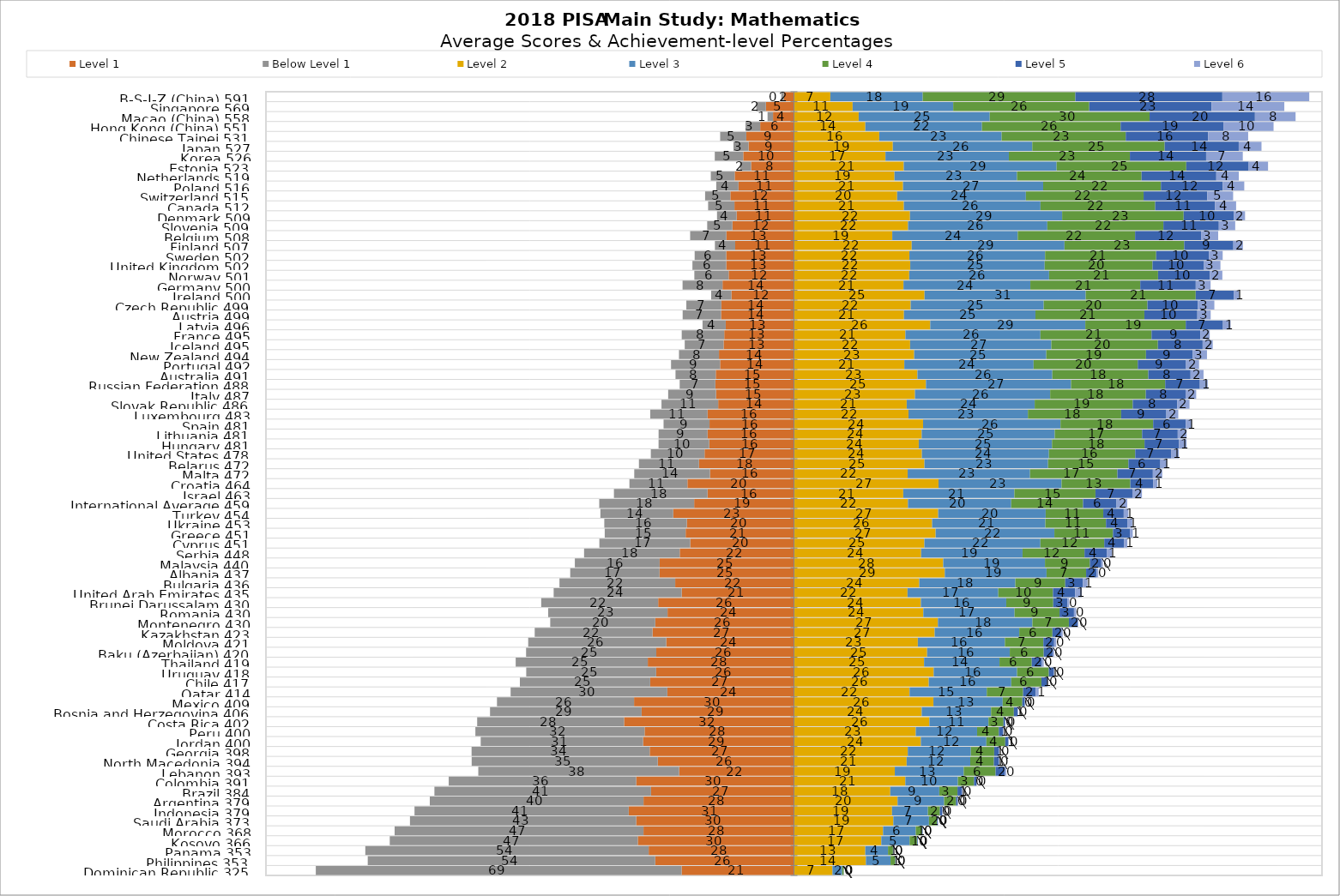
| Category | Level 1                | Below Level 1      | Level 2          | Level 3                | Level 4                | Level 5            | Level 6         |
|---|---|---|---|---|---|---|---|
| Dominican Republic 325 | -21.278 | -69.28 | 7.291 | 1.844 | 0.279 | 0.028 | 0 |
| Philippines 353 | -26.277 | -54.444 | 13.62 | 4.67 | 0.911 | 0.076 | 0.003 |
| Panama 353 | -27.518 | -53.663 | 13.5 | 4.308 | 0.939 | 0.072 | 0.001 |
| Kosovo 366 | -29.581 | -46.97 | 16.535 | 5.367 | 1.399 | 0.135 | 0.012 |
| Morocco 368 | -28.499 | -47.133 | 16.869 | 6.201 | 1.164 | 0.131 | 0.003 |
| Saudi Arabia 373 | -29.887 | -42.836 | 18.816 | 6.752 | 1.532 | 0.159 | 0.017 |
| Indonesia 379 | -31.296 | -40.568 | 18.568 | 6.804 | 2.272 | 0.45 | 0.043 |
| Argentina 379 | -28.494 | -40.473 | 19.619 | 8.82 | 2.257 | 0.328 | 0.01 |
| Brazil 384 | -27.069 | -41.025 | 18.237 | 9.284 | 3.446 | 0.81 | 0.13 |
| Colombia 391 | -29.886 | -35.501 | 21.089 | 9.95 | 3.059 | 0.487 | 0.029 |
| Lebanon 393 | -21.751 | -38.034 | 19.096 | 13.057 | 6.028 | 1.74 | 0.293 |
| North Macedonia 394 | -25.795 | -35.241 | 21.338 | 12.054 | 4.475 | 0.957 | 0.14 |
| Georgia 398 | -27.323 | -33.731 | 21.554 | 11.947 | 4.421 | 0.915 | 0.109 |
| Jordan 400 | -28.578 | -30.748 | 24.03 | 12.411 | 3.571 | 0.599 | 0.064 |
| Peru 400 | -28.295 | -32.041 | 23.063 | 11.622 | 4.119 | 0.79 | 0.071 |
| Costa Rica 402 | -32.18 | -27.818 | 25.645 | 11.194 | 2.842 | 0.313 | 0.008 |
| Bosnia and Herzegovina 406 | -28.855 | -28.709 | 24.193 | 13.137 | 4.314 | 0.738 | 0.054 |
| Mexico 409 | -30.285 | -25.962 | 26.412 | 13.119 | 3.714 | 0.469 | 0.039 |
| Qatar 414 | -23.984 | -29.677 | 21.898 | 14.615 | 6.881 | 2.383 | 0.563 |
| Chile 417 | -27.231 | -24.677 | 25.528 | 15.622 | 5.715 | 1.098 | 0.128 |
| Uruguay 418 | -26.1 | -24.605 | 26.458 | 15.794 | 6.012 | 0.971 | 0.059 |
| Thailand 419 | -27.688 | -25.012 | 24.64 | 14.282 | 6.11 | 1.927 | 0.342 |
| Baku (Azerbaijan) 420 | -26.074 | -24.661 | 25.21 | 15.662 | 6.422 | 1.682 | 0.289 |
| Moldova 421 | -24.191 | -26.142 | 23.457 | 16.491 | 7.283 | 2.047 | 0.389 |
| Kazakhstan 423 | -26.788 | -22.312 | 26.643 | 16.025 | 6.282 | 1.624 | 0.326 |
| Montenegro 430 | -26.27 | -19.891 | 27.257 | 17.899 | 6.91 | 1.623 | 0.151 |
| Romania 430 | -23.946 | -22.605 | 24.495 | 17.284 | 8.519 | 2.732 | 0.419 |
| Brunei Darussalam 430 | -25.72 | -22.148 | 24.037 | 16.169 | 8.894 | 2.677 | 0.355 |
| United Arab Emirates 435 | -21.266 | -24.244 | 21.502 | 17.191 | 10.355 | 4.209 | 1.235 |
| Bulgaria 436 | -22.492 | -21.921 | 23.725 | 18.204 | 9.445 | 3.333 | 0.881 |
| Albania 437 | -25.459 | -16.914 | 28.562 | 19.272 | 7.497 | 1.973 | 0.323 |
| Malaysia 440 | -25.438 | -16.06 | 28.265 | 19.273 | 8.503 | 2.17 | 0.291 |
| Serbia 448 | -21.637 | -18.113 | 24.082 | 19.208 | 11.733 | 4.211 | 1.017 |
| Cyprus 451 | -19.653 | -17.202 | 24.695 | 21.976 | 12.092 | 3.726 | 0.656 |
| Greece 451 | -20.522 | -15.317 | 26.827 | 22.493 | 11.097 | 3.206 | 0.538 |
| Ukraine 453 | -20.291 | -15.629 | 26.164 | 21.451 | 11.476 | 4.035 | 0.953 |
| Turkey 454 | -22.863 | -13.796 | 27.307 | 20.366 | 10.902 | 3.878 | 0.888 |
| International Average 459 | -18.904 | -17.977 | 21.58 | 19.559 | 13.606 | 6.347 | 2.027 |
| Israel 463 | -16.367 | -17.728 | 20.695 | 21.049 | 15.354 | 6.995 | 1.812 |
| Croatia 464 | -20.181 | -10.98 | 27.379 | 23.299 | 13.021 | 4.315 | 0.826 |
| Malta 472 | -15.909 | -14.339 | 21.533 | 23.175 | 16.551 | 6.71 | 1.783 |
| Belarus 472 | -17.989 | -11.373 | 24.707 | 23.409 | 15.224 | 6.057 | 1.241 |
| United States 478 | -16.939 | -10.17 | 24.223 | 24.059 | 16.347 | 6.785 | 1.477 |
| Hungary 481 | -16.054 | -9.589 | 23.631 | 25.234 | 17.525 | 6.539 | 1.429 |
| Lithuania 481 | -16.361 | -9.276 | 24.186 | 25.201 | 16.545 | 6.752 | 1.68 |
| Spain 481 | -15.995 | -8.701 | 24.447 | 26.033 | 17.545 | 6.181 | 1.099 |
| Luxembourg 483 | -16.357 | -10.861 | 21.692 | 22.609 | 17.67 | 8.556 | 2.256 |
| Slovak Republic 486 | -14.356 | -10.732 | 21.352 | 24.236 | 18.574 | 8.404 | 2.346 |
| Italy 487 | -14.763 | -9.06 | 22.913 | 25.606 | 18.118 | 7.527 | 2.012 |
| Russian Federation 488 | -14.889 | -6.754 | 24.994 | 27.479 | 17.831 | 6.569 | 1.485 |
| Australia 491 | -14.814 | -7.619 | 23.377 | 25.55 | 18.177 | 8.004 | 2.459 |
| Portugal 492 | -13.995 | -9.286 | 20.897 | 24.486 | 19.727 | 9.144 | 2.465 |
| New Zealand 494 | -14.206 | -7.573 | 22.76 | 25.027 | 18.883 | 8.847 | 2.704 |
| Iceland 495 | -13.332 | -7.358 | 21.997 | 26.742 | 20.187 | 8.473 | 1.913 |
| France 495 | -13.209 | -8.047 | 21.102 | 25.575 | 21.043 | 9.232 | 1.793 |
| Latvia 496 | -12.924 | -4.393 | 25.806 | 29.372 | 19.018 | 7.055 | 1.433 |
| Austria 499 | -13.807 | -7.272 | 20.827 | 24.907 | 20.629 | 10.033 | 2.525 |
| Czech Republic 499 | -13.759 | -6.626 | 22.106 | 25.195 | 19.647 | 9.527 | 3.141 |
| Ireland 500 | -11.855 | -3.832 | 24.721 | 30.529 | 20.834 | 7.201 | 1.028 |
| Germany 500 | -13.535 | -7.562 | 20.741 | 24.027 | 20.816 | 10.51 | 2.81 |
| Norway 501 | -12.373 | -6.493 | 21.821 | 26.495 | 20.634 | 9.828 | 2.356 |
| United Kingdom 502 | -12.818 | -6.411 | 22.024 | 25.457 | 20.427 | 9.751 | 3.111 |
| Sweden 502 | -12.831 | -5.977 | 21.86 | 25.701 | 21.035 | 9.982 | 2.614 |
| Finland 507 | -11.13 | -3.845 | 22.296 | 28.937 | 22.667 | 9.316 | 1.81 |
| Belgium 508 | -12.799 | -6.863 | 18.617 | 23.766 | 22.224 | 12.499 | 3.233 |
| Slovenia 509 | -11.66 | -4.774 | 21.597 | 26.385 | 21.981 | 10.502 | 3.101 |
| Denmark 509 | -10.856 | -3.715 | 21.971 | 28.82 | 23.01 | 9.507 | 2.121 |
| Canada 512 | -11.275 | -4.986 | 20.811 | 25.877 | 21.722 | 11.311 | 4.018 |
| Switzerland 515 | -12.049 | -4.779 | 19.537 | 24.388 | 22.288 | 12.078 | 4.88 |
| Poland 516 | -10.51 | -4.21 | 20.653 | 26.544 | 22.3 | 11.702 | 4.081 |
| Netherlands 519 | -11.232 | -4.518 | 19.027 | 23.217 | 23.584 | 14.154 | 4.267 |
| Estonia 523 | -8.13 | -2.087 | 20.791 | 28.953 | 24.554 | 11.821 | 3.665 |
| Korea 526 | -9.609 | -5.39 | 17.327 | 23.37 | 22.922 | 14.439 | 6.943 |
| Japan 527 | -8.597 | -2.858 | 18.72 | 26.412 | 25.073 | 14.028 | 4.313 |
| Chinese Taipei 531 | -9.026 | -4.953 | 16.149 | 23.18 | 23.499 | 15.613 | 7.58 |
| Hong Kong (China) 551 | -6.396 | -2.774 | 13.513 | 22.093 | 26.261 | 19.462 | 9.501 |
| Macao (China) 558 | -3.966 | -1.035 | 12.254 | 24.825 | 30.27 | 19.952 | 7.698 |
| Singapore 569 | -5.317 | -1.818 | 11.107 | 19.051 | 25.762 | 23.167 | 13.779 |
| B-S-J-Z (China) 591 | -1.915 | -0.497 | 6.888 | 17.501 | 28.897 | 27.843 | 16.459 |